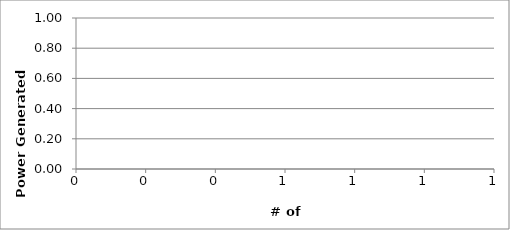
| Category | Power vs. # of Blades |
|---|---|
|  | 0 |
|  | 0 |
|  | 0 |
|  | 0 |
|  | 0 |
|  | 0 |
|  | 0 |
|  | 0 |
|  | 0 |
|  | 0 |
|  | 0 |
|  | 0 |
|  | 0 |
|  | 0 |
|  | 0 |
|  | 0 |
|  | 0 |
|  | 0 |
|  | 0 |
|  | 0 |
|  | 0 |
|  | 0 |
|  | 0 |
|  | 0 |